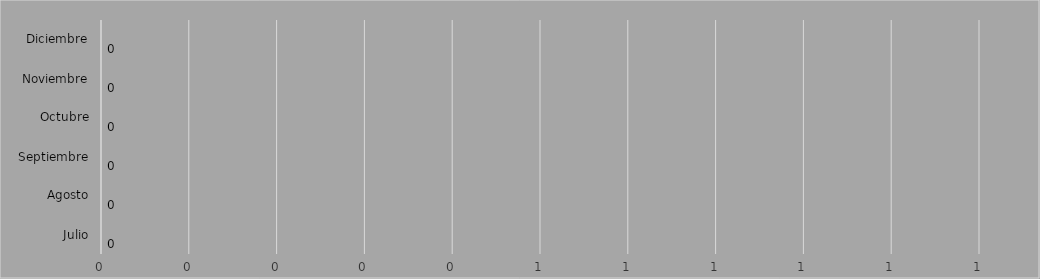
| Category | Series 0 | Series 1 |
|---|---|---|
| Julio | 0 |  |
| Agosto | 0 |  |
| Septiembre | 0 |  |
| Octubre | 0 |  |
| Noviembre | 0 |  |
| Diciembre | 0 |  |